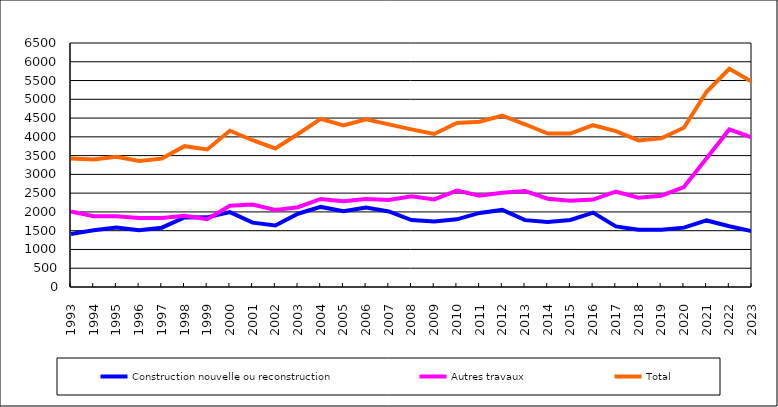
| Category | Construction nouvelle ou reconstruction | Autres travaux | Total |
|---|---|---|---|
| 1993.0 | 1412 | 2011 | 3423 |
| 1994.0 | 1514 | 1884 | 3398 |
| 1995.0 | 1583 | 1886 | 3469 |
| 1996.0 | 1515 | 1840 | 3355 |
| 1997.0 | 1580 | 1840 | 3420 |
| 1998.0 | 1852 | 1900 | 3752 |
| 1999.0 | 1856 | 1808 | 3664 |
| 2000.0 | 1996 | 2166 | 4162 |
| 2001.0 | 1715 | 2195 | 3910 |
| 2002.0 | 1640 | 2050 | 3690 |
| 2003.0 | 1952 | 2125 | 4077 |
| 2004.0 | 2133 | 2345 | 4478 |
| 2005.0 | 2019 | 2286 | 4305 |
| 2006.0 | 2120 | 2346 | 4466 |
| 2007.0 | 2013 | 2320 | 4333 |
| 2008.0 | 1783 | 2417 | 4200 |
| 2009.0 | 1742 | 2334 | 4076 |
| 2010.0 | 1802 | 2570 | 4372 |
| 2011.0 | 1973 | 2432 | 4405 |
| 2012.0 | 2054 | 2511 | 4565 |
| 2013.0 | 1781 | 2554 | 4335 |
| 2014.0 | 1733 | 2353 | 4086 |
| 2015.0 | 1785 | 2301 | 4086 |
| 2016.0 | 1981 | 2329 | 4310 |
| 2017.0 | 1614 | 2539 | 4153 |
| 2018.0 | 1527 | 2378 | 3905 |
| 2019.0 | 1526 | 2433 | 3959 |
| 2020.0 | 1581 | 2661 | 4242 |
| 2021.0 | 1773 | 3427 | 5200 |
| 2022.0 | 1617 | 4197 | 5814 |
| 2023.0 | 1487 | 3980 | 5467 |